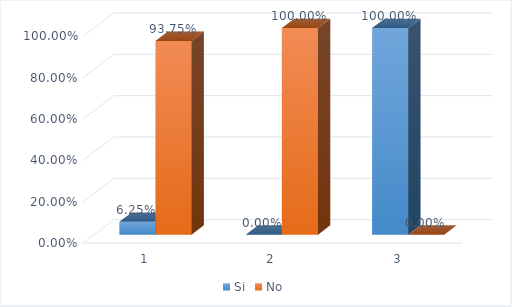
| Category | Si | No |
|---|---|---|
| 0 | 0.062 | 0.938 |
| 1 | 0 | 1 |
| 2 | 1 | 0 |